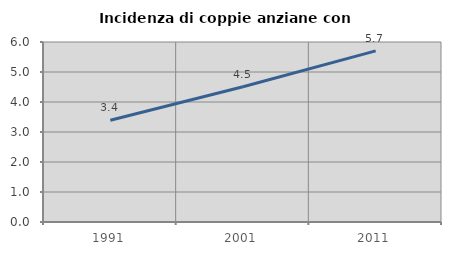
| Category | Incidenza di coppie anziane con figli |
|---|---|
| 1991.0 | 3.394 |
| 2001.0 | 4.509 |
| 2011.0 | 5.705 |